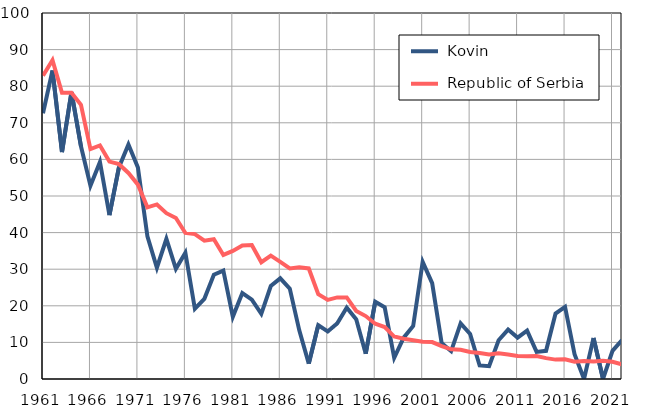
| Category |  Kovin |  Republic of Serbia |
|---|---|---|
| 1961.0 | 72.6 | 82.9 |
| 1962.0 | 84.3 | 87.1 |
| 1963.0 | 62 | 78.2 |
| 1964.0 | 78.4 | 78.2 |
| 1965.0 | 63.6 | 74.9 |
| 1966.0 | 52.8 | 62.8 |
| 1967.0 | 59.3 | 63.8 |
| 1968.0 | 44.8 | 59.4 |
| 1969.0 | 57.8 | 58.7 |
| 1970.0 | 64.1 | 56.3 |
| 1971.0 | 57.8 | 53.1 |
| 1972.0 | 39 | 46.9 |
| 1973.0 | 30.4 | 47.7 |
| 1974.0 | 38.3 | 45.3 |
| 1975.0 | 30.1 | 44 |
| 1976.0 | 34.5 | 39.9 |
| 1977.0 | 19.2 | 39.6 |
| 1978.0 | 21.9 | 37.8 |
| 1979.0 | 28.5 | 38.2 |
| 1980.0 | 29.6 | 33.9 |
| 1981.0 | 17 | 35 |
| 1982.0 | 23.5 | 36.5 |
| 1983.0 | 21.7 | 36.6 |
| 1984.0 | 17.8 | 31.9 |
| 1985.0 | 25.4 | 33.7 |
| 1986.0 | 27.5 | 32 |
| 1987.0 | 24.7 | 30.2 |
| 1988.0 | 13.3 | 30.5 |
| 1989.0 | 4.2 | 30.2 |
| 1990.0 | 14.7 | 23.2 |
| 1991.0 | 13 | 21.6 |
| 1992.0 | 15.2 | 22.3 |
| 1993.0 | 19.5 | 22.3 |
| 1994.0 | 16.3 | 18.6 |
| 1995.0 | 6.9 | 17.2 |
| 1996.0 | 21.1 | 15.1 |
| 1997.0 | 19.6 | 14.2 |
| 1998.0 | 5.8 | 11.6 |
| 1999.0 | 11.3 | 11 |
| 2000.0 | 14.5 | 10.6 |
| 2001.0 | 32 | 10.2 |
| 2002.0 | 26.2 | 10.1 |
| 2003.0 | 9.8 | 9 |
| 2004.0 | 7.6 | 8.1 |
| 2005.0 | 15.2 | 8 |
| 2006.0 | 12.3 | 7.4 |
| 2007.0 | 3.7 | 7.1 |
| 2008.0 | 3.5 | 6.7 |
| 2009.0 | 10.6 | 7 |
| 2010.0 | 13.5 | 6.7 |
| 2011.0 | 11.3 | 6.3 |
| 2012.0 | 13.2 | 6.2 |
| 2013.0 | 7.4 | 6.3 |
| 2014.0 | 7.7 | 5.7 |
| 2015.0 | 17.9 | 5.3 |
| 2016.0 | 19.7 | 5.4 |
| 2017.0 | 6.8 | 4.7 |
| 2018.0 | 0 | 4.9 |
| 2019.0 | 11.2 | 4.8 |
| 2020.0 | 0 | 5 |
| 2021.0 | 7.7 | 4.7 |
| 2022.0 | 10.6 | 4 |